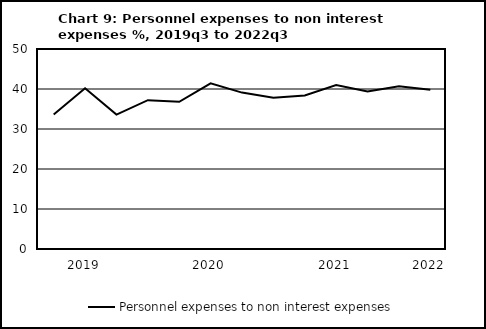
| Category | Personnel expenses to non interest expenses |
|---|---|
| nan | 33.6 |
| 2019.0 | 40.2 |
| nan | 33.6 |
| nan | 37.2 |
| nan | 36.8 |
| 2020.0 | 41.4 |
| nan | 39.1 |
| nan | 37.8 |
| nan | 38.4 |
| 2021.0 | 41 |
| nan | 39.4 |
| nan | 40.7 |
| 2022.0 | 39.8 |